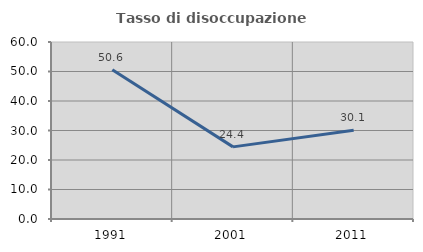
| Category | Tasso di disoccupazione giovanile  |
|---|---|
| 1991.0 | 50.584 |
| 2001.0 | 24.444 |
| 2011.0 | 30.081 |